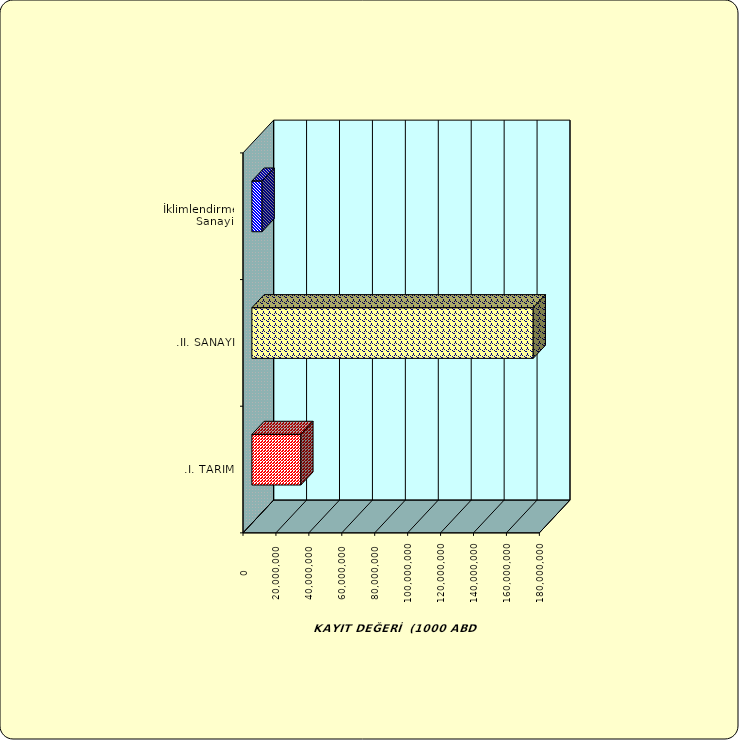
| Category | Series 0 |
|---|---|
| .I. TARIM | 29737574.68 |
| .II. SANAYİ | 170880410.196 |
|  İklimlendirme Sanayii | 6196123.821 |